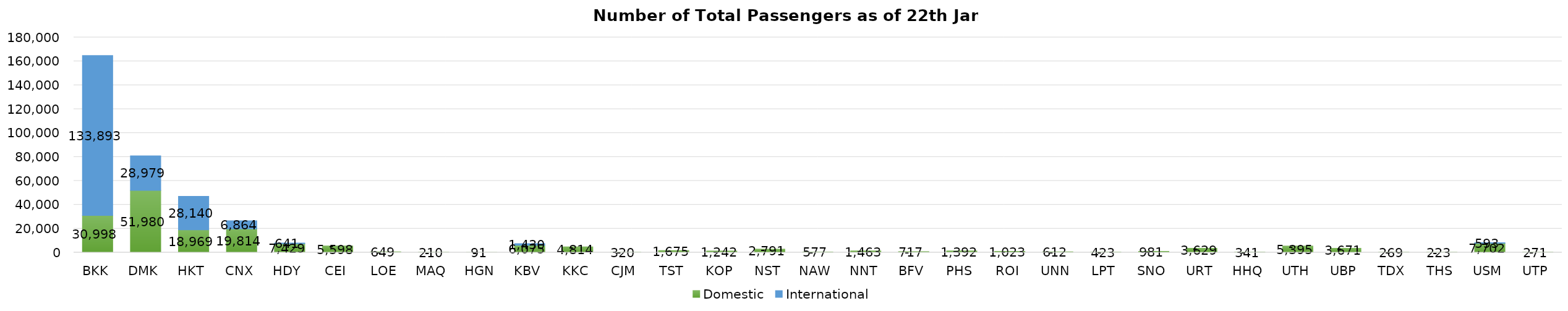
| Category | Domestic | International |
|---|---|---|
| BKK | 30998 | 133893 |
| DMK | 51980 | 28979 |
| HKT | 18969 | 28140 |
| CNX | 19814 | 6864 |
| HDY | 7429 | 641 |
| CEI | 5598 | 0 |
| LOE | 649 | 0 |
| MAQ | 210 | 0 |
| HGN | 91 | 0 |
| KBV | 6075 | 1430 |
| KKC | 4814 | 0 |
| CJM | 320 | 0 |
| TST | 1675 | 0 |
| KOP | 1242 | 0 |
| NST | 2791 | 0 |
| NAW | 577 | 0 |
| NNT | 1463 | 0 |
| BFV | 717 | 0 |
| PHS | 1392 | 0 |
| ROI | 1023 | 0 |
| UNN | 612 | 0 |
| LPT | 423 | 0 |
| SNO | 981 | 0 |
| URT | 3629 | 0 |
| HHQ | 341 | 0 |
| UTH | 5395 | 0 |
| UBP | 3671 | 0 |
| TDX | 269 | 0 |
| THS | 223 | 0 |
| USM | 7702 | 593 |
| UTP | 271 | 0 |